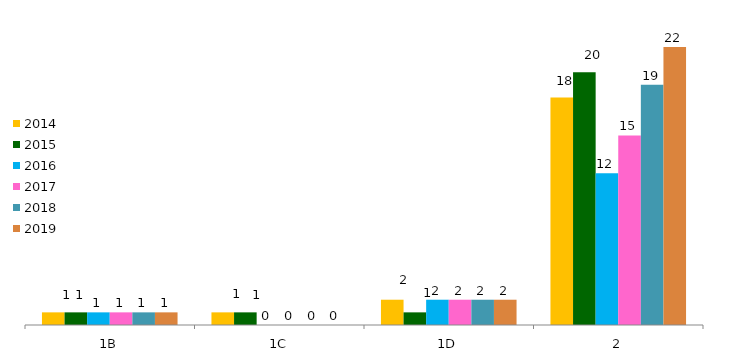
| Category | 2014 | 2015 | 2016 | 2017 | 2018 | 2019 |
|---|---|---|---|---|---|---|
| 1B | 1 | 1 | 1 | 1 | 1 | 1 |
| 1C | 1 | 1 | 0 | 0 | 0 | 0 |
| 1D | 2 | 1 | 2 | 2 | 2 | 2 |
| 2 | 18 | 20 | 12 | 15 | 19 | 22 |